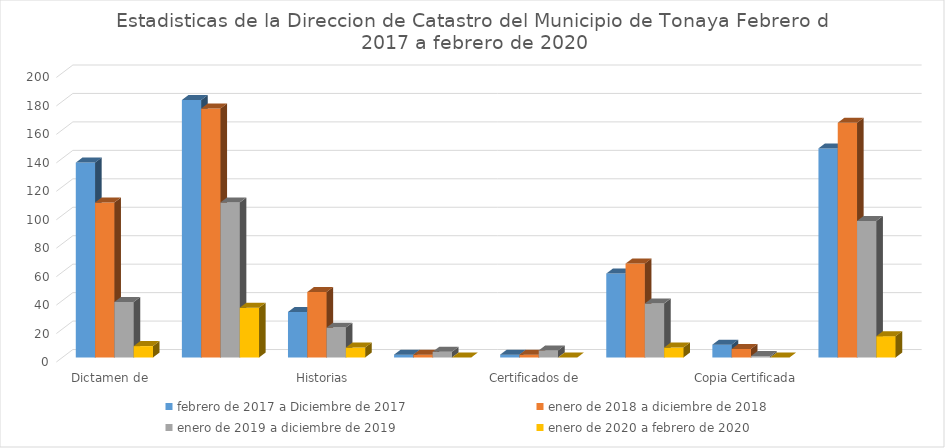
| Category | febrero de 2017 a Diciembre de 2017 | enero de 2018 a diciembre de 2018 | enero de 2019 a diciembre de 2019 | enero de 2020 a febrero de 2020 |
|---|---|---|---|---|
| Dictamen de Valor | 137 | 109 | 39 | 8 |
| Certificados de no Adeudo | 181 | 175 | 109 | 35 |
| Historias Catastrales | 32 | 46 | 21 | 7 |
| Certificados de no Propiedad | 2 | 2 | 4 | 0 |
| Certificados de Propiedad | 2 | 2 | 5 | 0 |
| Autorizaciones de Avaluos  | 59 | 66 | 38 | 7 |
| Copia Certificada | 9 | 6 | 1 | 0 |
| Avisos de Transmiccion Patrimonial  | 147 | 165 | 96 | 15 |